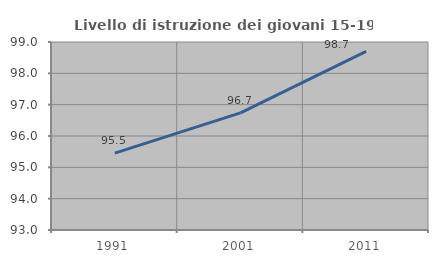
| Category | Livello di istruzione dei giovani 15-19 anni |
|---|---|
| 1991.0 | 95.455 |
| 2001.0 | 96.739 |
| 2011.0 | 98.701 |